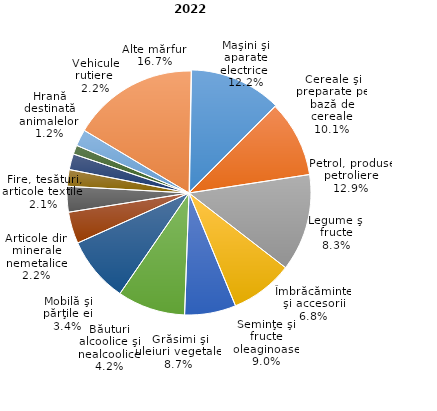
| Category | % |
|---|---|
| Maşini şi aparate electrice  | 12.2 |
| Cereale şi preparate pe bază de cereale | 10.1 |
| Petrol, produse petroliere | 12.9 |
| Legume şi fructe | 8.3 |
| Îmbrăcăminte şi accesorii | 6.8 |
| Seminţe şi fructe oleaginoase | 9 |
| Grăsimi şi uleiuri vegetale  | 8.7 |
| Băuturi alcoolice şi nealcoolice | 4.2 |
| Mobilă şi părţile ei | 3.4 |
| Articole din minerale nemetalice | 2.2 |
| Fire, tesături, articole textile  | 2.1 |
| Hrană destinată animalelor  | 1.2 |
| Vehicule rutiere  | 2.2 |
| Alte mărfuri | 16.7 |